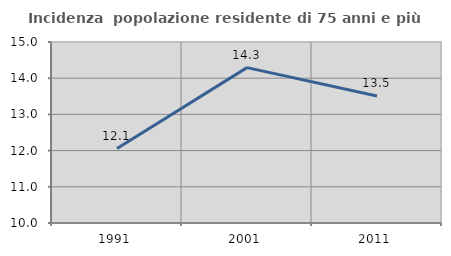
| Category | Incidenza  popolazione residente di 75 anni e più |
|---|---|
| 1991.0 | 12.055 |
| 2001.0 | 14.292 |
| 2011.0 | 13.507 |